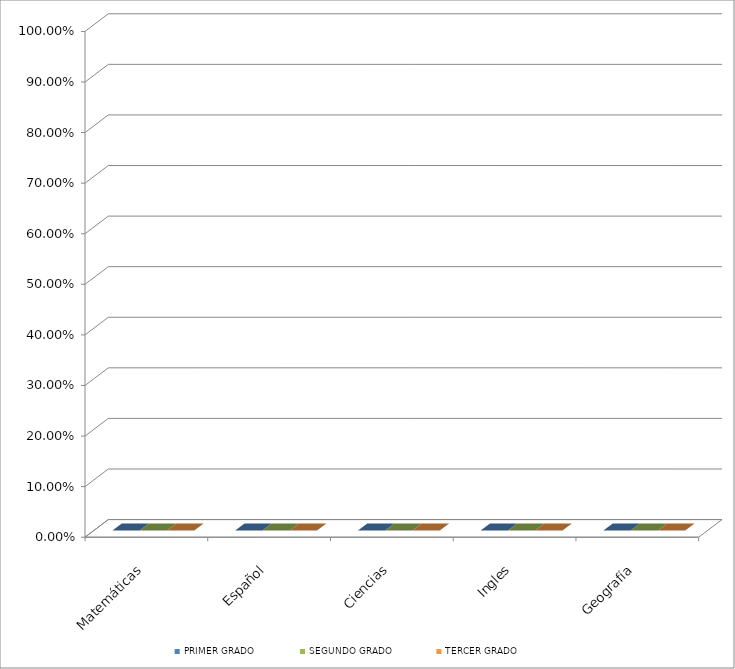
| Category | PRIMER GRADO | SEGUNDO GRADO | TERCER GRADO |
|---|---|---|---|
| 0 | 0 | 0 | 0 |
| 1 | 0 | 0 | 0 |
| 2 | 0 | 0 | 0 |
| 3 | 0 | 0 | 0 |
| 4 | 0 | 0 | 0 |